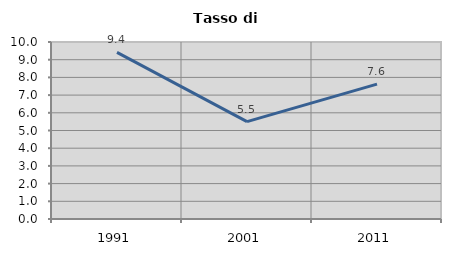
| Category | Tasso di disoccupazione   |
|---|---|
| 1991.0 | 9.41 |
| 2001.0 | 5.5 |
| 2011.0 | 7.622 |